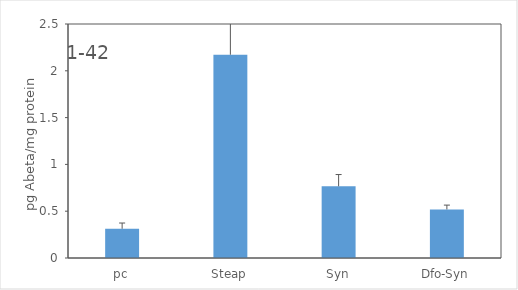
| Category | average |
|---|---|
| pc | 0.312 |
| Steap | 2.172 |
| Syn | 0.766 |
| Dfo-Syn | 0.519 |